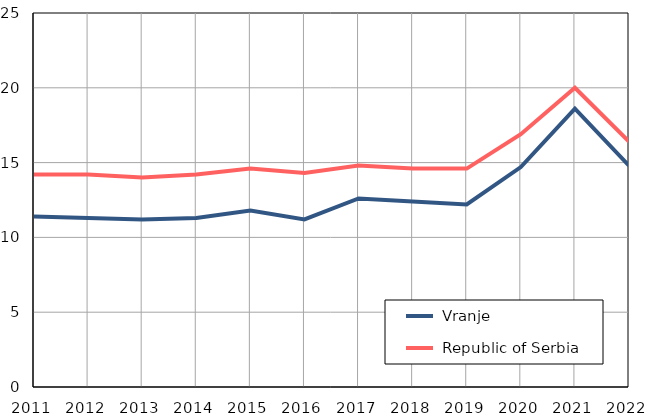
| Category |  Vranje |  Republic of Serbia |
|---|---|---|
| 2011.0 | 11.4 | 14.2 |
| 2012.0 | 11.3 | 14.2 |
| 2013.0 | 11.2 | 14 |
| 2014.0 | 11.3 | 14.2 |
| 2015.0 | 11.8 | 14.6 |
| 2016.0 | 11.2 | 14.3 |
| 2017.0 | 12.6 | 14.8 |
| 2018.0 | 12.4 | 14.6 |
| 2019.0 | 12.2 | 14.6 |
| 2020.0 | 14.7 | 16.9 |
| 2021.0 | 18.6 | 20 |
| 2022.0 | 14.8 | 16.4 |